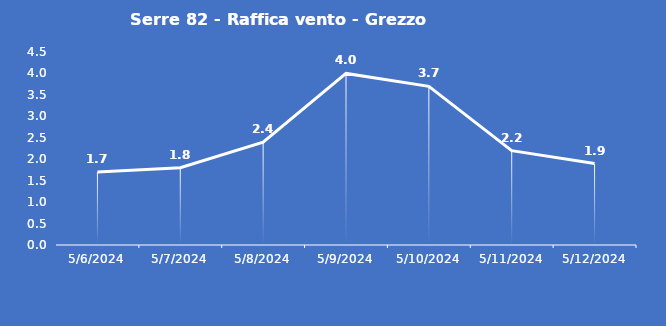
| Category | Serre 82 - Raffica vento - Grezzo (m/s) |
|---|---|
| 5/6/24 | 1.7 |
| 5/7/24 | 1.8 |
| 5/8/24 | 2.4 |
| 5/9/24 | 4 |
| 5/10/24 | 3.7 |
| 5/11/24 | 2.2 |
| 5/12/24 | 1.9 |